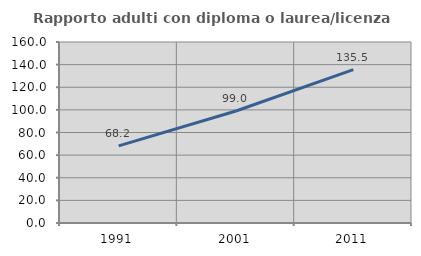
| Category | Rapporto adulti con diploma o laurea/licenza media  |
|---|---|
| 1991.0 | 68.229 |
| 2001.0 | 99.029 |
| 2011.0 | 135.509 |